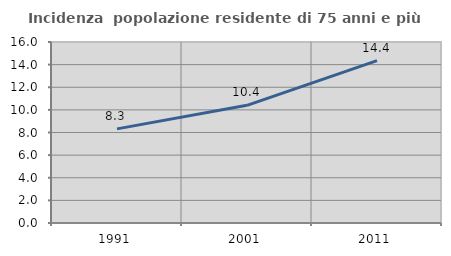
| Category | Incidenza  popolazione residente di 75 anni e più |
|---|---|
| 1991.0 | 8.321 |
| 2001.0 | 10.403 |
| 2011.0 | 14.358 |